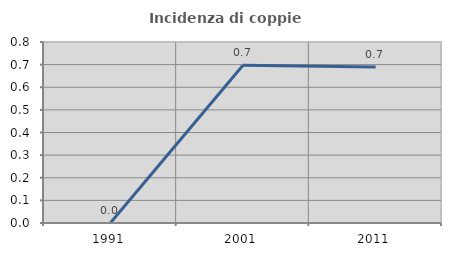
| Category | Incidenza di coppie miste |
|---|---|
| 1991.0 | 0 |
| 2001.0 | 0.697 |
| 2011.0 | 0.69 |